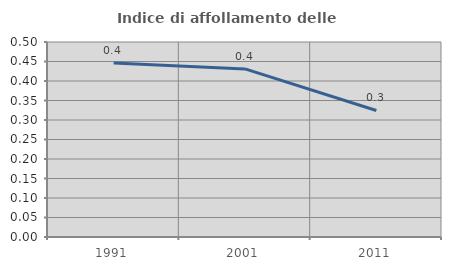
| Category | Indice di affollamento delle abitazioni  |
|---|---|
| 1991.0 | 0.446 |
| 2001.0 | 0.431 |
| 2011.0 | 0.324 |